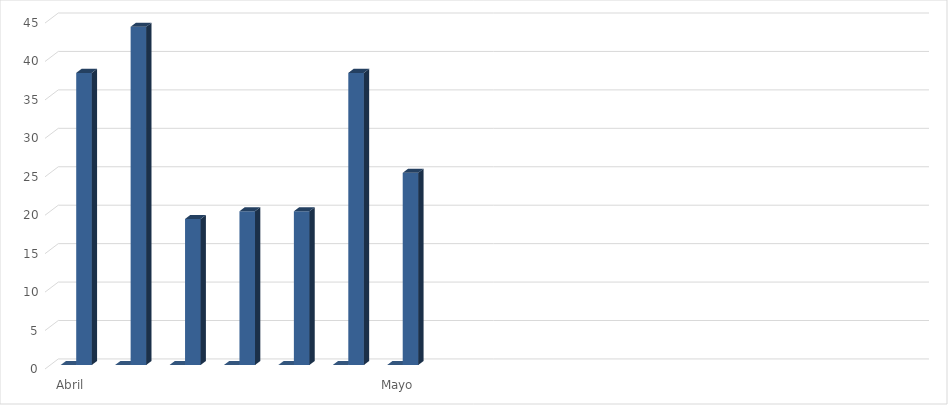
| Category | Series 0 | Series 1 |
|---|---|---|
| Abril | 0 | 38 |
|  | 0 | 44 |
|  | 0 | 19 |
|  | 0 | 20 |
|  | 0 | 20 |
|  | 0 | 38 |
| Mayo | 0 | 25 |